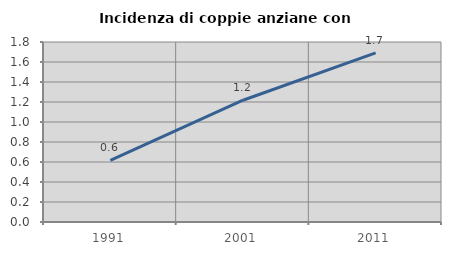
| Category | Incidenza di coppie anziane con figli |
|---|---|
| 1991.0 | 0.615 |
| 2001.0 | 1.218 |
| 2011.0 | 1.691 |